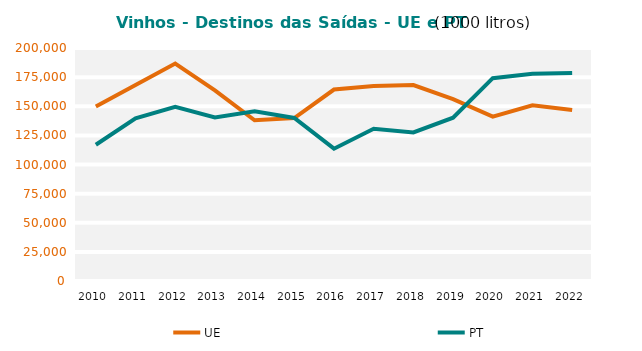
| Category | UE | PT |
|---|---|---|
| 2010.0 | 149697.999 | 116947.391 |
| 2011.0 | 168182.016 | 139679.028 |
| 2012.0 | 186663.374 | 149604.514 |
| 2013.0 | 163606.36 | 140455.15 |
| 2014.0 | 137980.941 | 145635.892 |
| 2015.0 | 139860.276 | 139958.587 |
| 2016.0 | 164364.067 | 113586.418 |
| 2017.0 | 167411.936 | 130745.011 |
| 2018.0 | 168240.696 | 127579.124 |
| 2019.0 | 156156.853 | 140164.125 |
| 2020.0 | 141042.235 | 174096.164 |
| 2021.0 | 150816.967 | 177985.605 |
| 2022.0 | 146859.944 | 178497.46 |